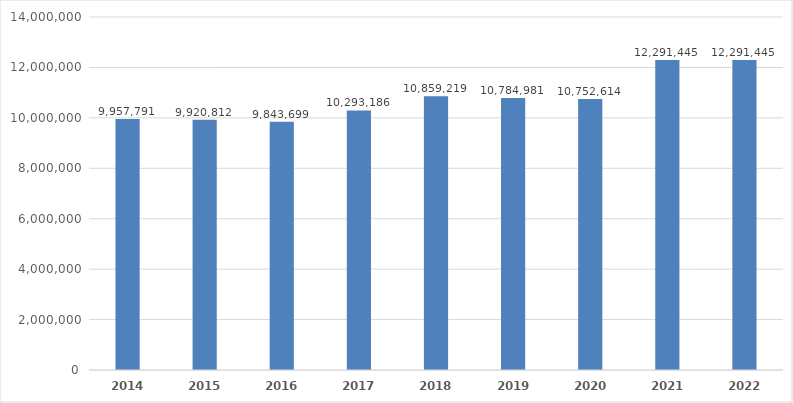
| Category | Series 0 | año |
|---|---|---|
| 2014.0 | 9957790.75 |  |
| 2015.0 | 9920811.76 |  |
| 2016.0 | 9843699.24 |  |
| 2017.0 | 10293186.36 |  |
| 2018.0 | 10859218.62 |  |
| 2019.0 | 10784981.49 |  |
| 2020.0 | 10752614.22 |  |
| 2021.0 | 12291444.52 |  |
| 2022.0 | 12291444.52 |  |